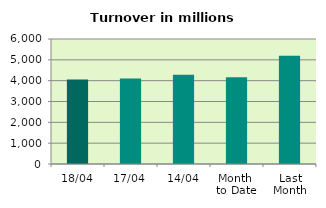
| Category | Series 0 |
|---|---|
| 18/04 | 4052.683 |
| 17/04 | 4108.07 |
| 14/04 | 4279.102 |
| Month 
to Date | 4165.542 |
| Last
Month | 5192.573 |